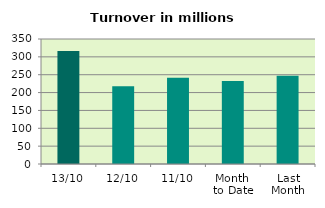
| Category | Series 0 |
|---|---|
| 13/10 | 316.442 |
| 12/10 | 217.993 |
| 11/10 | 241.653 |
| Month 
to Date | 232.612 |
| Last
Month | 247.353 |